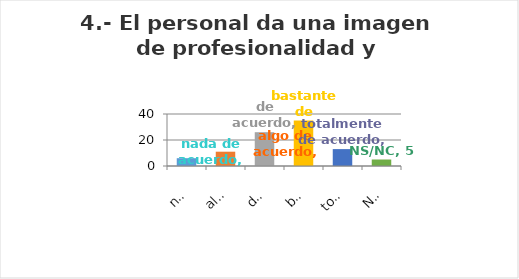
| Category | Series 0 |
|---|---|
| nada de acuerdo | 6 |
| algo de acuerdo | 11 |
| de acuerdo | 26 |
| bastante de acuerdo | 35 |
| totalmente de acuerdo | 13 |
| NS/NC | 5 |